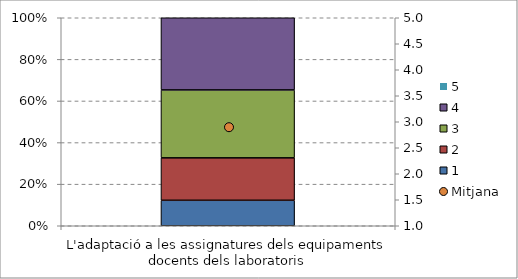
| Category | 1 | 2 | 3 | 4 | 5 |
|---|---|---|---|---|---|
| L'adaptació a les assignatures dels equipaments docents dels laboratoris | 6 | 10 | 16 | 17 | 0 |